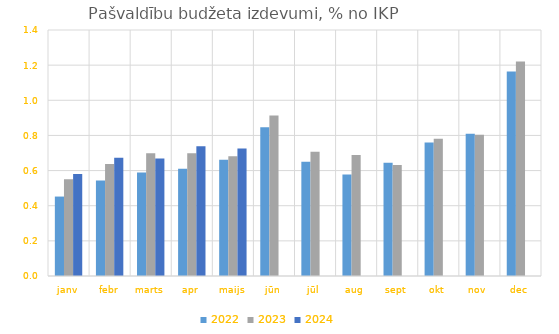
| Category | 2022 | 2023 | 2024 |
|---|---|---|---|
| janv | 0.452 | 0.55 | 0.58 |
| febr | 0.544 | 0.638 | 0.673 |
| marts | 0.589 | 0.698 | 0.669 |
| apr | 0.61 | 0.699 | 0.739 |
| maijs | 0.662 | 0.681 | 0.726 |
| jūn | 0.847 | 0.914 | 0 |
| jūl | 0.65 | 0.707 | 0 |
| aug | 0.578 | 0.688 | 0 |
| sept | 0.644 | 0.632 | 0 |
| okt | 0.759 | 0.781 | 0 |
| nov | 0.809 | 0.804 | 0 |
| dec | 1.164 | 1.221 | 0 |